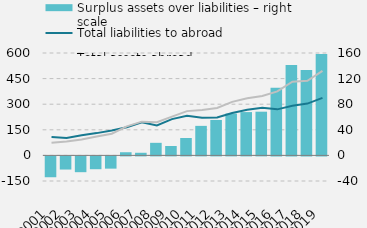
| Category | Surplus assets over liabilities – right scale |
|---|---|
| 0 | -32564.814 |
| 1 | -20524.014 |
| 2 | -24671.262 |
| 3 | -20020.738 |
| 4 | -19141.928 |
| 5 | 4941.54 |
| 6 | 4107.228 |
| 7 | 19653.422 |
| 8 | 14699.297 |
| 9 | 27224.988 |
| 10 | 46144.683 |
| 11 | 55368.915 |
| 12 | 65347.238 |
| 13 | 67665.623 |
| 14 | 68305.455 |
| 15 | 105525.4 |
| 16 | 141180.571 |
| 17 | 133390.265 |
| 18 | 158394 |